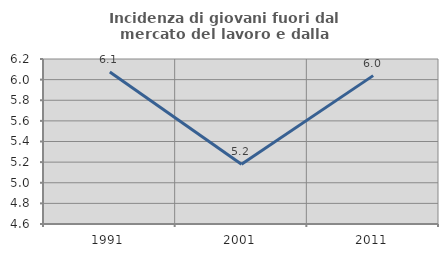
| Category | Incidenza di giovani fuori dal mercato del lavoro e dalla formazione  |
|---|---|
| 1991.0 | 6.073 |
| 2001.0 | 5.179 |
| 2011.0 | 6.039 |